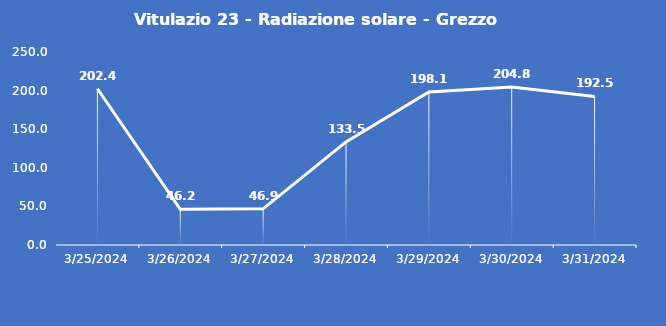
| Category | Vitulazio 23 - Radiazione solare - Grezzo (W/m2) |
|---|---|
| 3/25/24 | 202.4 |
| 3/26/24 | 46.2 |
| 3/27/24 | 46.9 |
| 3/28/24 | 133.5 |
| 3/29/24 | 198.1 |
| 3/30/24 | 204.8 |
| 3/31/24 | 192.5 |